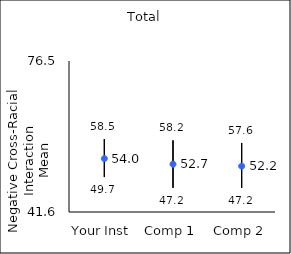
| Category | 25th percentile | 75th percentile | Mean |
|---|---|---|---|
| Your Inst | 49.7 | 58.5 | 53.98 |
| Comp 1 | 47.2 | 58.2 | 52.67 |
| Comp 2 | 47.2 | 57.6 | 52.22 |